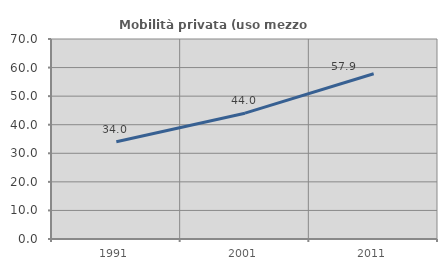
| Category | Mobilità privata (uso mezzo privato) |
|---|---|
| 1991.0 | 34.024 |
| 2001.0 | 44.043 |
| 2011.0 | 57.851 |